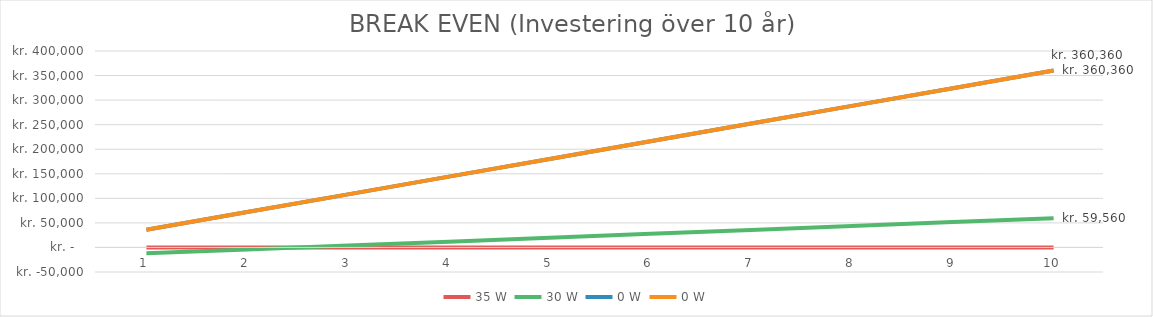
| Category | 35 W | 30 W | 0 W |
|---|---|---|---|
| 1.0 | 0 | -12044 | 36036 |
| 2.0 | 0 | -4088 | 72072 |
| 3.0 | 0 | 3868 | 108108 |
| 4.0 | 0 | 11824 | 144144 |
| 5.0 | 0 | 19780 | 180180 |
| 6.0 | 0 | 27736 | 216216 |
| 7.0 | 0 | 35692 | 252252 |
| 8.0 | 0 | 43648 | 288288 |
| 9.0 | 0 | 51604 | 324324 |
| 10.0 | 0 | 59560 | 360360 |